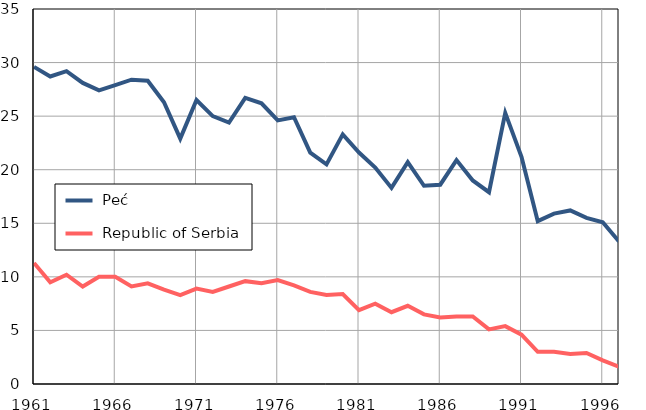
| Category |  Peć |  Republic of Serbia |
|---|---|---|
| 1961.0 | 29.6 | 11.3 |
| 1962.0 | 28.7 | 9.5 |
| 1963.0 | 29.2 | 10.2 |
| 1964.0 | 28.1 | 9.1 |
| 1965.0 | 27.4 | 10 |
| 1966.0 | 27.9 | 10 |
| 1967.0 | 28.4 | 9.1 |
| 1968.0 | 28.3 | 9.4 |
| 1969.0 | 26.3 | 8.8 |
| 1970.0 | 22.9 | 8.3 |
| 1971.0 | 26.5 | 8.9 |
| 1972.0 | 25 | 8.6 |
| 1973.0 | 24.4 | 9.1 |
| 1974.0 | 26.7 | 9.6 |
| 1975.0 | 26.2 | 9.4 |
| 1976.0 | 24.6 | 9.7 |
| 1977.0 | 24.9 | 9.2 |
| 1978.0 | 21.6 | 8.6 |
| 1979.0 | 20.5 | 8.3 |
| 1980.0 | 23.3 | 8.4 |
| 1981.0 | 21.6 | 6.9 |
| 1982.0 | 20.2 | 7.5 |
| 1983.0 | 18.3 | 6.7 |
| 1984.0 | 20.7 | 7.3 |
| 1985.0 | 18.5 | 6.5 |
| 1986.0 | 18.6 | 6.2 |
| 1987.0 | 20.9 | 6.3 |
| 1988.0 | 19 | 6.3 |
| 1989.0 | 17.9 | 5.1 |
| 1990.0 | 25.3 | 5.4 |
| 1991.0 | 21.2 | 4.6 |
| 1992.0 | 15.2 | 3 |
| 1993.0 | 15.9 | 3 |
| 1994.0 | 16.2 | 2.8 |
| 1995.0 | 15.5 | 2.9 |
| 1996.0 | 15.1 | 2.2 |
| 1997.0 | 13.3 | 1.6 |